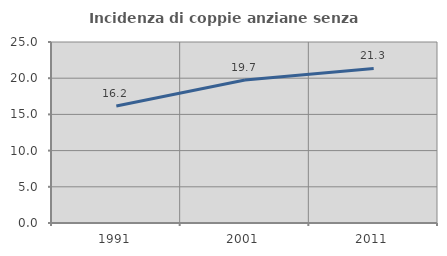
| Category | Incidenza di coppie anziane senza figli  |
|---|---|
| 1991.0 | 16.171 |
| 2001.0 | 19.739 |
| 2011.0 | 21.341 |